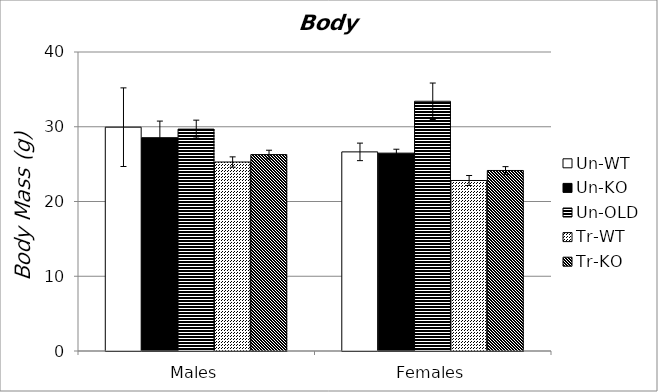
| Category | Un-WT | Un-KO | Un-OLD | Tr-WT | Tr-KO |
|---|---|---|---|---|---|
| 0 | 29.94 | 28.533 | 29.683 | 25.283 | 26.275 |
| 1 | 26.638 | 26.471 | 33.41 | 22.81 | 24.15 |